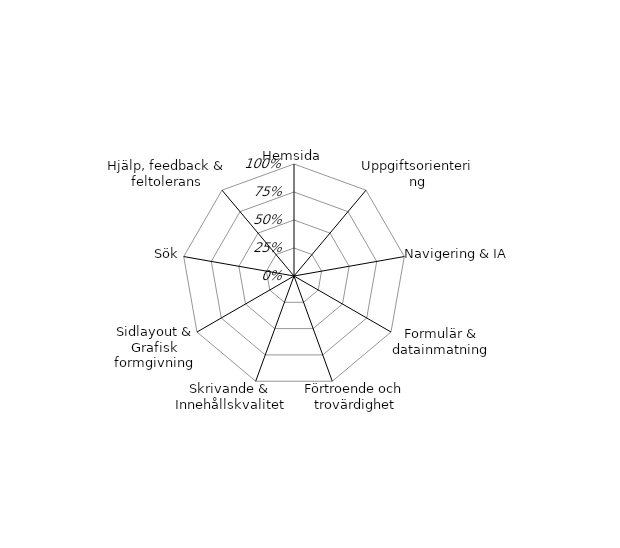
| Category | Series 0 |
|---|---|
| Hemsida | 0 |
| Uppgiftsorientering | 0 |
| Navigering & IA | 0 |
| Formulär & datainmatning | 0 |
| Förtroende och trovärdighet | 0 |
| Skrivande & Innehållskvalitet | 0 |
| Sidlayout & Grafisk formgivning | 0 |
| Sök | 0 |
| Hjälp, feedback & feltolerans | 0 |